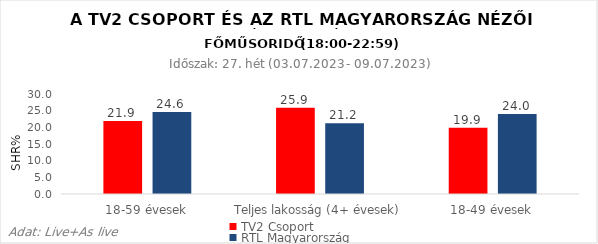
| Category | TV2 Csoport | RTL Magyarország |
|---|---|---|
| 18-59 évesek | 21.9 | 24.6 |
| Teljes lakosság (4+ évesek) | 25.9 | 21.2 |
| 18-49 évesek | 19.9 | 24 |